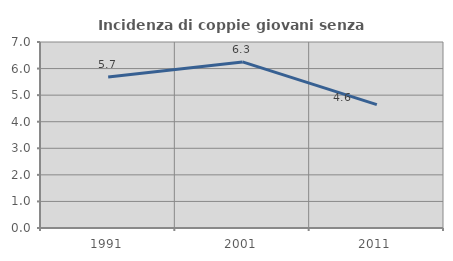
| Category | Incidenza di coppie giovani senza figli |
|---|---|
| 1991.0 | 5.682 |
| 2001.0 | 6.25 |
| 2011.0 | 4.645 |